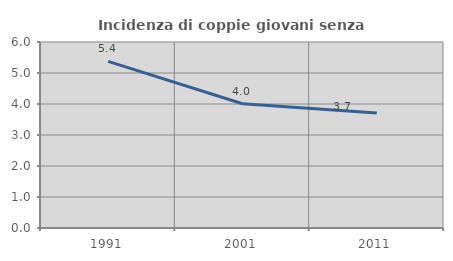
| Category | Incidenza di coppie giovani senza figli |
|---|---|
| 1991.0 | 5.377 |
| 2001.0 | 4.006 |
| 2011.0 | 3.707 |